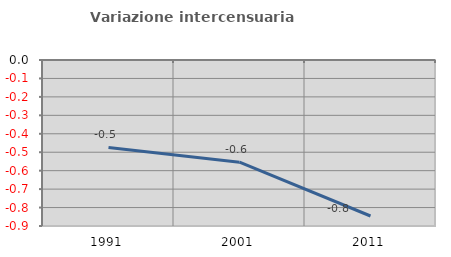
| Category | Variazione intercensuaria annua |
|---|---|
| 1991.0 | -0.474 |
| 2001.0 | -0.554 |
| 2011.0 | -0.846 |